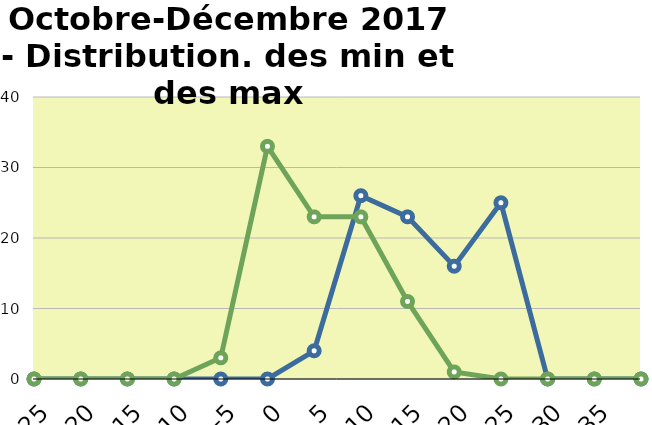
| Category | Distr. Max | Distr. Min |
|---|---|---|
| -25 | 0 | 0 |
| -20 | 0 | 0 |
| -15 | 0 | 0 |
| -10 | 0 | 0 |
| -5 | 0 | 3 |
| 0 | 0 | 33 |
| 5 | 4 | 23 |
| 10 | 26 | 23 |
| 15 | 23 | 11 |
| 20 | 16 | 1 |
| 25 | 25 | 0 |
| 30 | 0 | 0 |
| 35 | 0 | 0 |
|  | 0 | 0 |